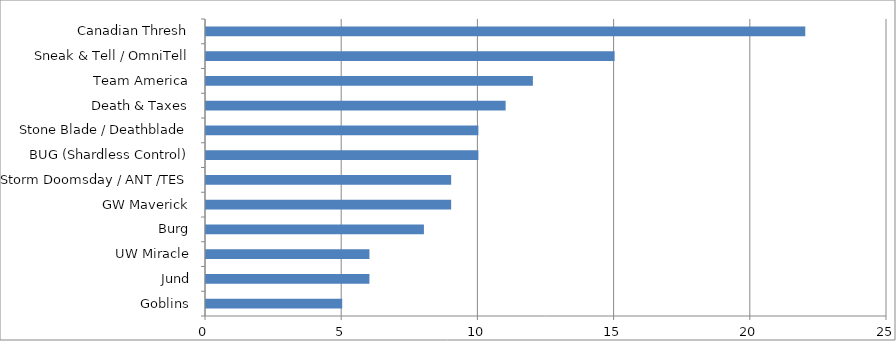
| Category | Series 0 |
|---|---|
| Goblins | 5 |
| Jund | 6 |
| UW Miracle | 6 |
| Burg | 8 |
| GW Maverick | 9 |
| Storm Doomsday / ANT /TES | 9 |
| BUG (Shardless Control) | 10 |
| Stone Blade / Deathblade | 10 |
| Death & Taxes | 11 |
| Team America | 12 |
| Sneak & Tell / OmniTell | 15 |
| Canadian Thresh | 22 |